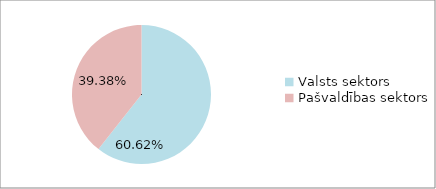
| Category | Series 0 |
|---|---|
| Valsts sektors | 0.606 |
| Pašvaldības sektors | 0.394 |